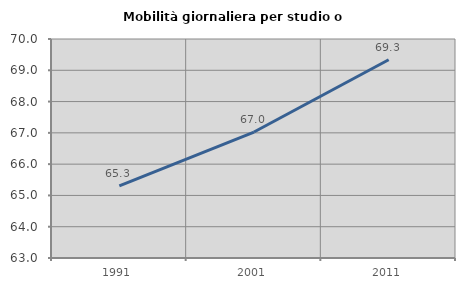
| Category | Mobilità giornaliera per studio o lavoro |
|---|---|
| 1991.0 | 65.307 |
| 2001.0 | 67.026 |
| 2011.0 | 69.338 |